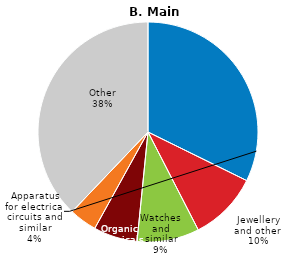
| Category | Series 0 |
|---|---|
| Medicine and pharmaceuti- cals | 71754540659 |
| Jewellery and other  | 22601154211 |
| Watches and similar | 20327112464 |
| Organic chemicals | 14308899000 |
| Apparatus for electrical circuits and similar | 9069644479 |
| Other | 84220971478 |